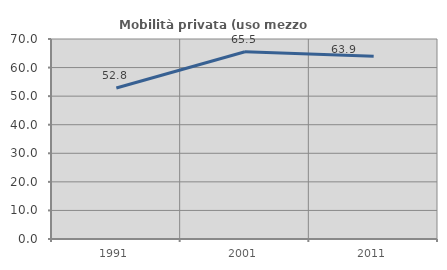
| Category | Mobilità privata (uso mezzo privato) |
|---|---|
| 1991.0 | 52.832 |
| 2001.0 | 65.516 |
| 2011.0 | 63.944 |